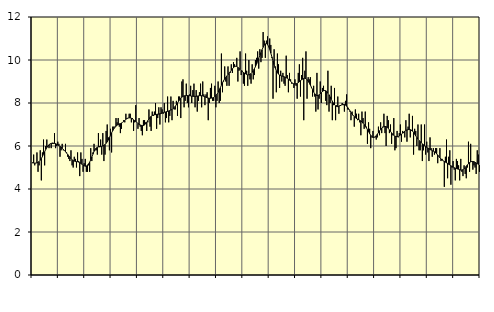
| Category | Piggar | Series 1 |
|---|---|---|
| nan | 5.2 | 5.23 |
| 87.0 | 5.6 | 5.21 |
| 87.0 | 5.1 | 5.2 |
| 87.0 | 5.2 | 5.21 |
| 87.0 | 5.7 | 5.22 |
| 87.0 | 4.8 | 5.24 |
| 87.0 | 5.1 | 5.28 |
| 87.0 | 5.8 | 5.34 |
| 87.0 | 4.4 | 5.42 |
| 87.0 | 5.7 | 5.51 |
| 87.0 | 6.3 | 5.62 |
| 87.0 | 5.1 | 5.73 |
| nan | 6 | 5.84 |
| 88.0 | 6.3 | 5.93 |
| 88.0 | 6 | 6 |
| 88.0 | 5.9 | 6.06 |
| 88.0 | 6.1 | 6.1 |
| 88.0 | 5.9 | 6.12 |
| 88.0 | 6.1 | 6.14 |
| 88.0 | 6.1 | 6.13 |
| 88.0 | 6.6 | 6.12 |
| 88.0 | 5.9 | 6.11 |
| 88.0 | 6 | 6.08 |
| 88.0 | 6.2 | 6.05 |
| nan | 6.1 | 6.02 |
| 89.0 | 5.5 | 5.98 |
| 89.0 | 5.8 | 5.94 |
| 89.0 | 6.1 | 5.89 |
| 89.0 | 5.8 | 5.84 |
| 89.0 | 5.8 | 5.79 |
| 89.0 | 6.1 | 5.74 |
| 89.0 | 5.7 | 5.67 |
| 89.0 | 5.5 | 5.61 |
| 89.0 | 5.4 | 5.54 |
| 89.0 | 5.3 | 5.47 |
| 89.0 | 5.8 | 5.41 |
| nan | 5.1 | 5.36 |
| 90.0 | 5 | 5.32 |
| 90.0 | 5.5 | 5.3 |
| 90.0 | 5.4 | 5.28 |
| 90.0 | 5 | 5.27 |
| 90.0 | 5.7 | 5.27 |
| 90.0 | 5.3 | 5.25 |
| 90.0 | 4.6 | 5.23 |
| 90.0 | 5.7 | 5.19 |
| 90.0 | 5.4 | 5.15 |
| 90.0 | 4.8 | 5.11 |
| 90.0 | 5.2 | 5.08 |
| nan | 5.4 | 5.06 |
| 91.0 | 4.8 | 5.07 |
| 91.0 | 4.8 | 5.11 |
| 91.0 | 5.1 | 5.17 |
| 91.0 | 4.8 | 5.25 |
| 91.0 | 5.9 | 5.36 |
| 91.0 | 5.3 | 5.49 |
| 91.0 | 5.7 | 5.62 |
| 91.0 | 6.1 | 5.75 |
| 91.0 | 5.8 | 5.84 |
| 91.0 | 5.8 | 5.91 |
| 91.0 | 5.6 | 5.94 |
| nan | 6.6 | 5.96 |
| 92.0 | 6 | 5.96 |
| 92.0 | 6.3 | 5.97 |
| 92.0 | 5.6 | 5.98 |
| 92.0 | 6.6 | 6 |
| 92.0 | 5.3 | 6.03 |
| 92.0 | 5.6 | 6.07 |
| 92.0 | 6.7 | 6.12 |
| 92.0 | 7 | 6.19 |
| 92.0 | 6.4 | 6.28 |
| 92.0 | 5.8 | 6.39 |
| 92.0 | 6.8 | 6.5 |
| nan | 5.7 | 6.61 |
| 93.0 | 6.9 | 6.71 |
| 93.0 | 6.9 | 6.8 |
| 93.0 | 6.9 | 6.87 |
| 93.0 | 7.3 | 6.92 |
| 93.0 | 7.1 | 6.97 |
| 93.0 | 7.3 | 7 |
| 93.0 | 6.9 | 7.03 |
| 93.0 | 6.6 | 7.04 |
| 93.0 | 6.8 | 7.07 |
| 93.0 | 7.1 | 7.1 |
| 93.0 | 7.2 | 7.14 |
| nan | 7.1 | 7.19 |
| 94.0 | 7.5 | 7.24 |
| 94.0 | 7.3 | 7.28 |
| 94.0 | 7.3 | 7.3 |
| 94.0 | 7.5 | 7.31 |
| 94.0 | 7.5 | 7.31 |
| 94.0 | 7.1 | 7.29 |
| 94.0 | 7.3 | 7.26 |
| 94.0 | 6.7 | 7.22 |
| 94.0 | 7.1 | 7.18 |
| 94.0 | 7.9 | 7.14 |
| 94.0 | 7.1 | 7.1 |
| nan | 6.8 | 7.05 |
| 95.0 | 7.3 | 7.01 |
| 95.0 | 6.9 | 6.98 |
| 95.0 | 6.7 | 6.96 |
| 95.0 | 6.5 | 6.95 |
| 95.0 | 7.2 | 6.95 |
| 95.0 | 7.2 | 6.98 |
| 95.0 | 7.1 | 7.03 |
| 95.0 | 6.7 | 7.1 |
| 95.0 | 7.1 | 7.18 |
| 95.0 | 7.7 | 7.26 |
| 95.0 | 6.9 | 7.33 |
| nan | 6.7 | 7.38 |
| 96.0 | 7.6 | 7.42 |
| 96.0 | 7.4 | 7.44 |
| 96.0 | 7.6 | 7.45 |
| 96.0 | 8 | 7.46 |
| 96.0 | 6.8 | 7.47 |
| 96.0 | 7.3 | 7.48 |
| 96.0 | 7.8 | 7.48 |
| 96.0 | 7 | 7.5 |
| 96.0 | 7.8 | 7.51 |
| 96.0 | 7.7 | 7.53 |
| 96.0 | 7.5 | 7.55 |
| nan | 8 | 7.57 |
| 97.0 | 7.1 | 7.58 |
| 97.0 | 7.3 | 7.6 |
| 97.0 | 8.3 | 7.61 |
| 97.0 | 7.1 | 7.63 |
| 97.0 | 7.4 | 7.65 |
| 97.0 | 8.3 | 7.67 |
| 97.0 | 7.2 | 7.7 |
| 97.0 | 8.1 | 7.74 |
| 97.0 | 7.7 | 7.79 |
| 97.0 | 7.7 | 7.85 |
| 97.0 | 8.1 | 7.92 |
| nan | 7.4 | 8 |
| 98.0 | 8.3 | 8.08 |
| 98.0 | 8.3 | 8.15 |
| 98.0 | 7.3 | 8.22 |
| 98.0 | 9 | 8.27 |
| 98.0 | 9.1 | 8.31 |
| 98.0 | 7.8 | 8.33 |
| 98.0 | 8.1 | 8.34 |
| 98.0 | 8.9 | 8.35 |
| 98.0 | 8 | 8.35 |
| 98.0 | 7.8 | 8.34 |
| 98.0 | 8.4 | 8.34 |
| nan | 8.8 | 8.33 |
| 99.0 | 8 | 8.32 |
| 99.0 | 8.6 | 8.31 |
| 99.0 | 8.9 | 8.31 |
| 99.0 | 7.8 | 8.31 |
| 99.0 | 8.6 | 8.31 |
| 99.0 | 7.6 | 8.32 |
| 99.0 | 8.1 | 8.33 |
| 99.0 | 8.5 | 8.34 |
| 99.0 | 8.9 | 8.34 |
| 99.0 | 7.8 | 8.34 |
| 99.0 | 9 | 8.33 |
| nan | 8.4 | 8.31 |
| 0.0 | 7.9 | 8.29 |
| 0.0 | 8.4 | 8.27 |
| 0.0 | 8.5 | 8.24 |
| 0.0 | 7.2 | 8.23 |
| 0.0 | 8 | 8.22 |
| 0.0 | 8.7 | 8.22 |
| 0.0 | 8.9 | 8.23 |
| 0.0 | 8.1 | 8.24 |
| 0.0 | 8.1 | 8.26 |
| 0.0 | 8.8 | 8.3 |
| 0.0 | 7.8 | 8.35 |
| nan | 8.1 | 8.41 |
| 1.0 | 9 | 8.5 |
| 1.0 | 8 | 8.6 |
| 1.0 | 8.1 | 8.71 |
| 1.0 | 10.3 | 8.83 |
| 1.0 | 8.5 | 8.94 |
| 1.0 | 9 | 9.04 |
| 1.0 | 9.7 | 9.12 |
| 1.0 | 9 | 9.19 |
| 1.0 | 8.8 | 9.26 |
| 1.0 | 9.7 | 9.32 |
| 1.0 | 8.8 | 9.38 |
| nan | 9.4 | 9.45 |
| 2.0 | 9.8 | 9.52 |
| 2.0 | 9.4 | 9.59 |
| 2.0 | 9.9 | 9.65 |
| 2.0 | 9.8 | 9.69 |
| 2.0 | 9.7 | 9.71 |
| 2.0 | 10.1 | 9.7 |
| 2.0 | 9 | 9.66 |
| 2.0 | 9.5 | 9.61 |
| 2.0 | 10.4 | 9.56 |
| 2.0 | 9.3 | 9.51 |
| 2.0 | 9.5 | 9.46 |
| nan | 8.9 | 9.42 |
| 3.0 | 8.8 | 9.39 |
| 3.0 | 10.3 | 9.36 |
| 3.0 | 9.5 | 9.33 |
| 3.0 | 8.8 | 9.31 |
| 3.0 | 10 | 9.31 |
| 3.0 | 9.1 | 9.33 |
| 3.0 | 8.9 | 9.37 |
| 3.0 | 9.8 | 9.43 |
| 3.0 | 9.1 | 9.5 |
| 3.0 | 9.3 | 9.59 |
| 3.0 | 10 | 9.69 |
| nan | 10.1 | 9.81 |
| 4.0 | 10.4 | 9.94 |
| 4.0 | 9.6 | 10.08 |
| 4.0 | 10.5 | 10.21 |
| 4.0 | 9.9 | 10.34 |
| 4.0 | 10.1 | 10.48 |
| 4.0 | 11.3 | 10.59 |
| 4.0 | 10.9 | 10.69 |
| 4.0 | 10.1 | 10.75 |
| 4.0 | 10.9 | 10.76 |
| 4.0 | 11.1 | 10.72 |
| 4.0 | 10.6 | 10.63 |
| nan | 11 | 10.49 |
| 5.0 | 10.7 | 10.32 |
| 5.0 | 10.1 | 10.14 |
| 5.0 | 8.2 | 9.95 |
| 5.0 | 10.5 | 9.78 |
| 5.0 | 9.7 | 9.63 |
| 5.0 | 8.5 | 9.5 |
| 5.0 | 10.3 | 9.41 |
| 5.0 | 9.8 | 9.34 |
| 5.0 | 8.7 | 9.3 |
| 5.0 | 9.5 | 9.27 |
| 5.0 | 9 | 9.26 |
| nan | 9.4 | 9.24 |
| 6.0 | 8.9 | 9.22 |
| 6.0 | 8.8 | 9.2 |
| 6.0 | 10.2 | 9.18 |
| 6.0 | 9.3 | 9.15 |
| 6.0 | 8.5 | 9.11 |
| 6.0 | 9.4 | 9.07 |
| 6.0 | 9.1 | 9.01 |
| 6.0 | 8.9 | 8.96 |
| 6.0 | 8.9 | 8.91 |
| 6.0 | 8.7 | 8.89 |
| 6.0 | 9.1 | 8.88 |
| nan | 8.8 | 8.89 |
| 7.0 | 8.2 | 8.91 |
| 7.0 | 9.4 | 8.95 |
| 7.0 | 9.8 | 8.99 |
| 7.0 | 8.3 | 9.04 |
| 7.0 | 9.3 | 9.08 |
| 7.0 | 10.1 | 9.11 |
| 7.0 | 7.2 | 9.14 |
| 7.0 | 9.5 | 9.15 |
| 7.0 | 10.4 | 9.13 |
| 7.0 | 8.2 | 9.09 |
| 7.0 | 9.2 | 9.03 |
| nan | 9.1 | 8.94 |
| 8.0 | 9.2 | 8.84 |
| 8.0 | 8.7 | 8.73 |
| 8.0 | 8.3 | 8.62 |
| 8.0 | 8.8 | 8.51 |
| 8.0 | 8.3 | 8.43 |
| 8.0 | 7.6 | 8.37 |
| 8.0 | 9.4 | 8.35 |
| 8.0 | 7.7 | 8.35 |
| 8.0 | 8.2 | 8.38 |
| 8.0 | 9 | 8.43 |
| 8.0 | 8 | 8.48 |
| nan | 8.7 | 8.53 |
| 9.0 | 8.8 | 8.57 |
| 9.0 | 8.6 | 8.58 |
| 9.0 | 8.1 | 8.57 |
| 9.0 | 7.9 | 8.53 |
| 9.0 | 9.5 | 8.46 |
| 9.0 | 7.6 | 8.38 |
| 9.0 | 8 | 8.28 |
| 9.0 | 8.8 | 8.18 |
| 9.0 | 7.2 | 8.08 |
| 9.0 | 7.9 | 8 |
| 9.0 | 8.7 | 7.92 |
| nan | 7.2 | 7.87 |
| 10.0 | 7.9 | 7.84 |
| 10.0 | 8.3 | 7.83 |
| 10.0 | 7.5 | 7.85 |
| 10.0 | 7.9 | 7.87 |
| 10.0 | 7.9 | 7.9 |
| 10.0 | 8 | 7.92 |
| 10.0 | 7.9 | 7.93 |
| 10.0 | 7.6 | 7.93 |
| 10.0 | 8.1 | 7.9 |
| 10.0 | 8.4 | 7.86 |
| 10.0 | 7.7 | 7.79 |
| nan | 7.7 | 7.72 |
| 11.0 | 7.6 | 7.64 |
| 11.0 | 7.2 | 7.56 |
| 11.0 | 7.6 | 7.49 |
| 11.0 | 7.4 | 7.42 |
| 11.0 | 6.9 | 7.36 |
| 11.0 | 7.7 | 7.32 |
| 11.0 | 7.5 | 7.28 |
| 11.0 | 7.2 | 7.25 |
| 11.0 | 7.5 | 7.23 |
| 11.0 | 7.1 | 7.2 |
| 11.0 | 6.5 | 7.16 |
| nan | 7.6 | 7.12 |
| 12.0 | 7.3 | 7.06 |
| 12.0 | 6.8 | 7 |
| 12.0 | 7.6 | 6.93 |
| 12.0 | 6.9 | 6.85 |
| 12.0 | 6.1 | 6.76 |
| 12.0 | 7.1 | 6.67 |
| 12.0 | 6.8 | 6.58 |
| 12.0 | 5.9 | 6.5 |
| 12.0 | 6.4 | 6.44 |
| 12.0 | 6.7 | 6.4 |
| 12.0 | 6.4 | 6.4 |
| nan | 6.4 | 6.43 |
| 13.0 | 6.3 | 6.48 |
| 13.0 | 6.4 | 6.55 |
| 13.0 | 6.9 | 6.62 |
| 13.0 | 6.5 | 6.7 |
| 13.0 | 7.1 | 6.77 |
| 13.0 | 6.6 | 6.83 |
| 13.0 | 6.9 | 6.87 |
| 13.0 | 7.5 | 6.9 |
| 13.0 | 6.6 | 6.91 |
| 13.0 | 6 | 6.9 |
| 13.0 | 7.4 | 6.87 |
| nan | 7.2 | 6.82 |
| 14.0 | 6.6 | 6.75 |
| 14.0 | 7 | 6.68 |
| 14.0 | 6.1 | 6.61 |
| 14.0 | 6.5 | 6.55 |
| 14.0 | 7.3 | 6.5 |
| 14.0 | 5.8 | 6.46 |
| 14.0 | 5.9 | 6.44 |
| 14.0 | 6.7 | 6.44 |
| 14.0 | 6.4 | 6.44 |
| 14.0 | 6.6 | 6.47 |
| 14.0 | 7 | 6.51 |
| nan | 6.2 | 6.55 |
| 15.0 | 6.7 | 6.6 |
| 15.0 | 6.6 | 6.65 |
| 15.0 | 6.4 | 6.69 |
| 15.0 | 7.2 | 6.72 |
| 15.0 | 6.2 | 6.75 |
| 15.0 | 6.9 | 6.76 |
| 15.0 | 7.5 | 6.77 |
| 15.0 | 6.4 | 6.76 |
| 15.0 | 6.7 | 6.74 |
| 15.0 | 7.4 | 6.7 |
| 15.0 | 5.6 | 6.63 |
| nan | 6.8 | 6.55 |
| 16.0 | 6.7 | 6.47 |
| 16.0 | 6 | 6.4 |
| 16.0 | 7 | 6.32 |
| 16.0 | 5.8 | 6.26 |
| 16.0 | 5.8 | 6.2 |
| 16.0 | 7 | 6.15 |
| 16.0 | 5.3 | 6.1 |
| 16.0 | 5.8 | 6.06 |
| 16.0 | 7 | 6.01 |
| 16.0 | 5.6 | 5.98 |
| 16.0 | 6.2 | 5.94 |
| nan | 5.7 | 5.91 |
| 17.0 | 5.3 | 5.88 |
| 17.0 | 6.4 | 5.84 |
| 17.0 | 5.9 | 5.81 |
| 17.0 | 5.5 | 5.78 |
| 17.0 | 5.9 | 5.76 |
| 17.0 | 5.6 | 5.73 |
| 17.0 | 5.9 | 5.69 |
| 17.0 | 5.9 | 5.64 |
| 17.0 | 5.2 | 5.58 |
| 17.0 | 5.5 | 5.51 |
| 17.0 | 5.9 | 5.45 |
| nan | 5.3 | 5.4 |
| 18.0 | 5.4 | 5.35 |
| 18.0 | 5.3 | 5.31 |
| 18.0 | 4.1 | 5.28 |
| 18.0 | 5.5 | 5.25 |
| 18.0 | 6.3 | 5.22 |
| 18.0 | 4.5 | 5.19 |
| 18.0 | 5.5 | 5.15 |
| 18.0 | 5.8 | 5.12 |
| 18.0 | 4.2 | 5.08 |
| 18.0 | 5 | 5.05 |
| 18.0 | 5.3 | 5.02 |
| nan | 4.9 | 4.99 |
| 19.0 | 4.4 | 4.97 |
| 19.0 | 5.4 | 4.95 |
| 19.0 | 5.3 | 4.93 |
| 19.0 | 5.1 | 4.92 |
| 19.0 | 4.4 | 4.9 |
| 19.0 | 5.4 | 4.88 |
| 19.0 | 4.8 | 4.88 |
| 19.0 | 4.6 | 4.9 |
| 19.0 | 5.1 | 4.94 |
| 19.0 | 4.7 | 4.99 |
| 19.0 | 4.5 | 5.06 |
| nan | 5 | 5.12 |
| 20.0 | 6.2 | 5.18 |
| 20.0 | 4.8 | 5.23 |
| 20.0 | 6.1 | 5.26 |
| 20.0 | 5.3 | 5.28 |
| 20.0 | 4.9 | 5.28 |
| 20.0 | 5.1 | 5.27 |
| 20.0 | 5 | 5.24 |
| 20.0 | 4.7 | 5.21 |
| 20.0 | 5.8 | 5.18 |
| 20.0 | 5.6 | 5.15 |
| 20.0 | 4.8 | 5.11 |